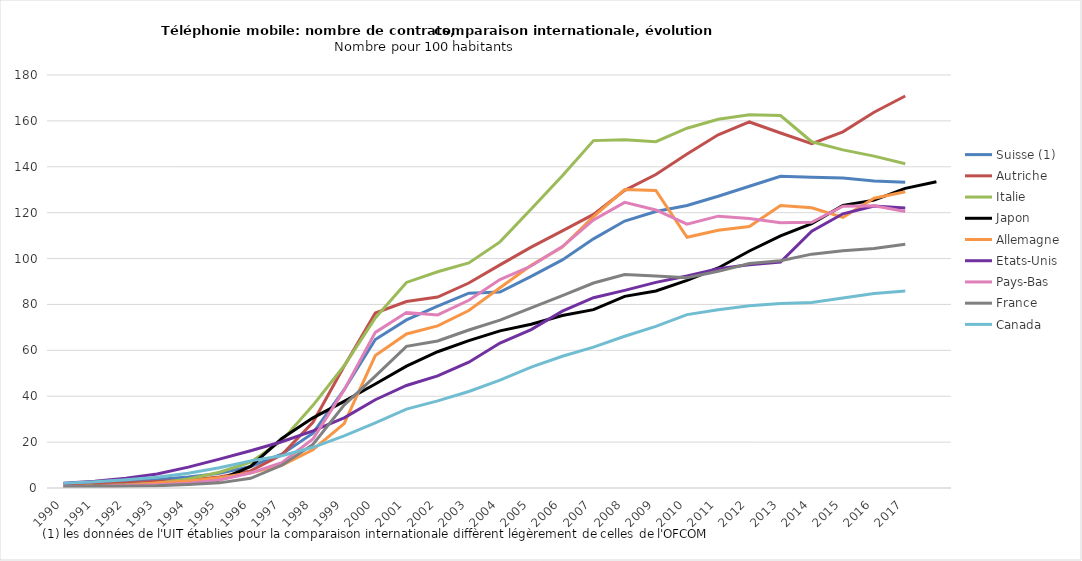
| Category | Suisse (1) | Autriche | Italie | Japon | Allemagne | Etats-Unis | Pays-Bas | France | Canada |
|---|---|---|---|---|---|---|---|---|---|
| 1990 | 1.874 | 0.961 | 0.468 | 0 | 0.339 | 2.076 | 0.531 | 0.497 | 2.111 |
| 1991 | 2.59 | 1.494 | 0.999 | 0.71 | 0.657 | 2.94 | 0.767 | 0.655 | 2.77 |
| 1992 | 3.156 | 2.212 | 1.376 | 1.123 | 1.191 | 4.249 | 1.099 | 0.76 | 3.621 |
| 1993 | 3.74 | 2.805 | 2.12 | 1.39 | 2.158 | 6.104 | 1.42 | 0.991 | 4.648 |
| 1994 | 4.773 | 3.505 | 3.932 | 1.724 | 3.01 | 9.105 | 2.096 | 1.523 | 6.436 |
| 1995 | 6.373 | 4.803 | 6.886 | 3.49 | 4.48 | 12.605 | 3.495 | 2.236 | 8.84 |
| 1996 | 9.387 | 7.475 | 11.279 | 9.409 | 6.61 | 16.238 | 6.549 | 4.21 | 11.822 |
| 1997 | 14.73 | 14.471 | 20.634 | 21.561 | 9.912 | 20.142 | 11.004 | 9.9 | 14.046 |
| 1998 | 23.878 | 28.629 | 36.04 | 30.591 | 16.662 | 24.891 | 21.36 | 18.989 | 17.737 |
| 1999 | 42.841 | 53.078 | 53.27 | 37.765 | 28.082 | 30.576 | 42.767 | 36.134 | 22.722 |
| 2000 | 64.733 | 76.269 | 74.134 | 45.302 | 57.718 | 38.468 | 67.813 | 48.739 | 28.429 |
| 2001 | 73.267 | 81.26 | 89.591 | 53.124 | 67.15 | 44.691 | 76.488 | 61.754 | 34.366 |
| 2002 | 79.214 | 83.245 | 94.258 | 59.393 | 70.655 | 48.851 | 75.425 | 64.068 | 37.949 |
| 2003 | 84.908 | 89.336 | 98.103 | 64.253 | 77.338 | 54.847 | 81.815 | 68.872 | 42.071 |
| 2004 | 85.4 | 97.26 | 107.27 | 68.489 | 87.28 | 63.18 | 90.87 | 73.16 | 47.01 |
| 2005 | 92.23 | 104.98 | 121.58 | 71.34 | 97.06 | 69.02 | 96.74 | 78.53 | 52.7 |
| 2006 | 99.4 | 112.03 | 136.12 | 75.18 | 105.04 | 77.09 | 105.21 | 83.88 | 57.43 |
| 2007 | 108.58 | 119.25 | 151.4 | 77.73 | 118.3 | 82.94 | 116.83 | 89.34 | 61.41 |
| 2008 | 116.36 | 129.71 | 151.83 | 83.53 | 130.07 | 86.13 | 124.49 | 93.01 | 66.14 |
| 2009 | 120.49 | 136.61 | 150.96 | 85.88 | 129.68 | 89.61 | 121.18 | 92.39 | 70.47 |
| 2010 | 123.14 | 145.55 | 156.82 | 90.46 | 109.28 | 92.38 | 114.96 | 91.68 | 75.58 |
| 2011 | 127.14 | 153.93 | 160.71 | 95.9 | 112.31 | 95.61 | 118.48 | 94.43 | 77.71 |
| 2012 | 131.49 | 159.53 | 162.7 | 103.31 | 113.98 | 97.29 | 117.44 | 97.83 | 79.43 |
| 2013 | 135.85 | 154.73 | 162.34 | 109.89 | 123.1 | 98.47 | 115.6 | 99.07 | 80.44 |
| 2014 | 135.49 | 150.03 | 150.9 | 115.26 | 122.14 | 111.89 | 115.82 | 101.92 | 80.86 |
| 2015 | 135.14 | 155.22 | 147.37 | 123.17 | 117.93 | 119.5 | 122.85 | 103.45 | 82.8 |
| 2016 | 133.81 | 163.79 | 144.63 | 125.46 | 126.31 | 122.88 | 122.97 | 104.4 | 84.74 |
| 2017 | 133.22 | 170.85 | 141.29 | 130.61 | 129.09 | 122.01 | 120.52 | 106.21 | 85.9 |